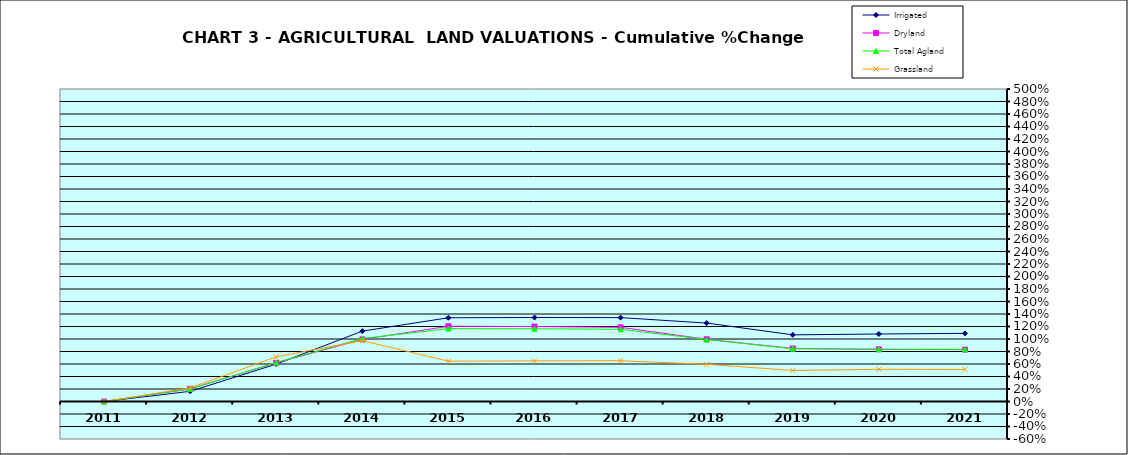
| Category | Irrigated | Dryland | Total Agland | Grassland |
|---|---|---|---|---|
| 2011.0 | 0 | 0 | 0 | 0 |
| 2012.0 | 0.163 | 0.203 | 0.199 | 0.217 |
| 2013.0 | 0.598 | 0.619 | 0.624 | 0.715 |
| 2014.0 | 1.126 | 0.994 | 1.007 | 0.974 |
| 2015.0 | 1.34 | 1.204 | 1.166 | 0.645 |
| 2016.0 | 1.344 | 1.2 | 1.164 | 0.65 |
| 2017.0 | 1.342 | 1.187 | 1.155 | 0.653 |
| 2018.0 | 1.255 | 0.996 | 0.992 | 0.595 |
| 2019.0 | 1.066 | 0.848 | 0.844 | 0.497 |
| 2020.0 | 1.08 | 0.834 | 0.837 | 0.515 |
| 2021.0 | 1.09 | 0.829 | 0.835 | 0.513 |